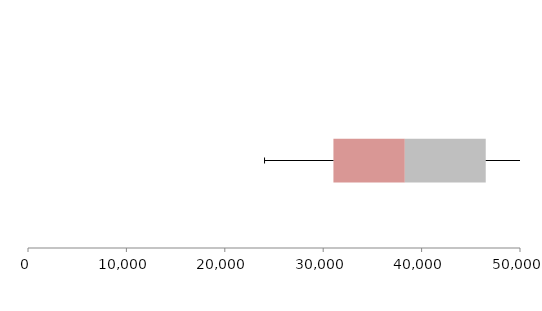
| Category | Series 1 | Series 2 | Series 3 |
|---|---|---|---|
| 0 | 31039.715 | 7256.149 | 8221.401 |